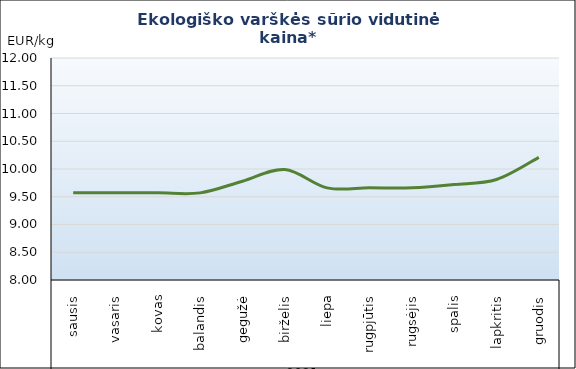
| Category | Varškės sūris |
|---|---|
| 0 | 9.57 |
| 1 | 9.57 |
| 2 | 9.57 |
| 3 | 9.57 |
| 4 | 9.78 |
| 5 | 9.99 |
| 6 | 9.66 |
| 7 | 9.66 |
| 8 | 9.66 |
| 9 | 9.72 |
| 10 | 9.81 |
| 11 | 10.21 |